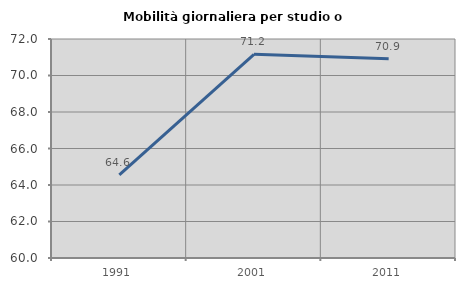
| Category | Mobilità giornaliera per studio o lavoro |
|---|---|
| 1991.0 | 64.554 |
| 2001.0 | 71.163 |
| 2011.0 | 70.921 |